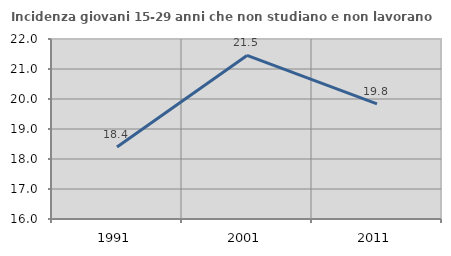
| Category | Incidenza giovani 15-29 anni che non studiano e non lavorano  |
|---|---|
| 1991.0 | 18.403 |
| 2001.0 | 21.452 |
| 2011.0 | 19.836 |